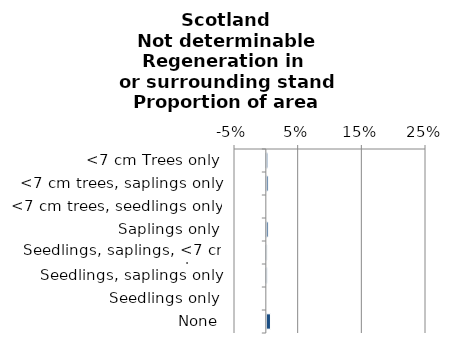
| Category | Not determinable |
|---|---|
| None | 0.006 |
| Seedlings only | 0 |
| Seedlings, saplings only | 0.001 |
| Seedlings, saplings, <7 cm trees | 0 |
| Saplings only | 0.002 |
| <7 cm trees, seedlings only | 0 |
| <7 cm trees, saplings only | 0.002 |
| <7 cm Trees only | 0.002 |